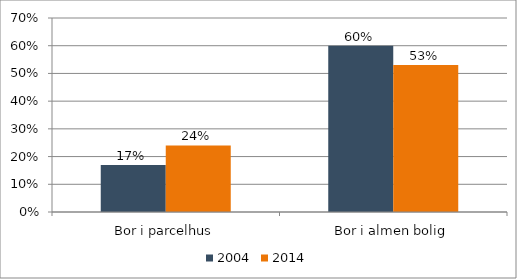
| Category | 2004 | 2014 |
|---|---|---|
| Bor i parcelhus | 0.17 | 0.24 |
| Bor i almen bolig | 0.6 | 0.53 |